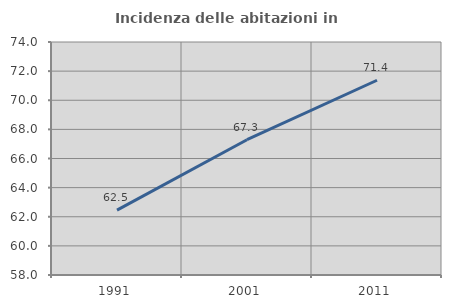
| Category | Incidenza delle abitazioni in proprietà  |
|---|---|
| 1991.0 | 62.459 |
| 2001.0 | 67.291 |
| 2011.0 | 71.374 |